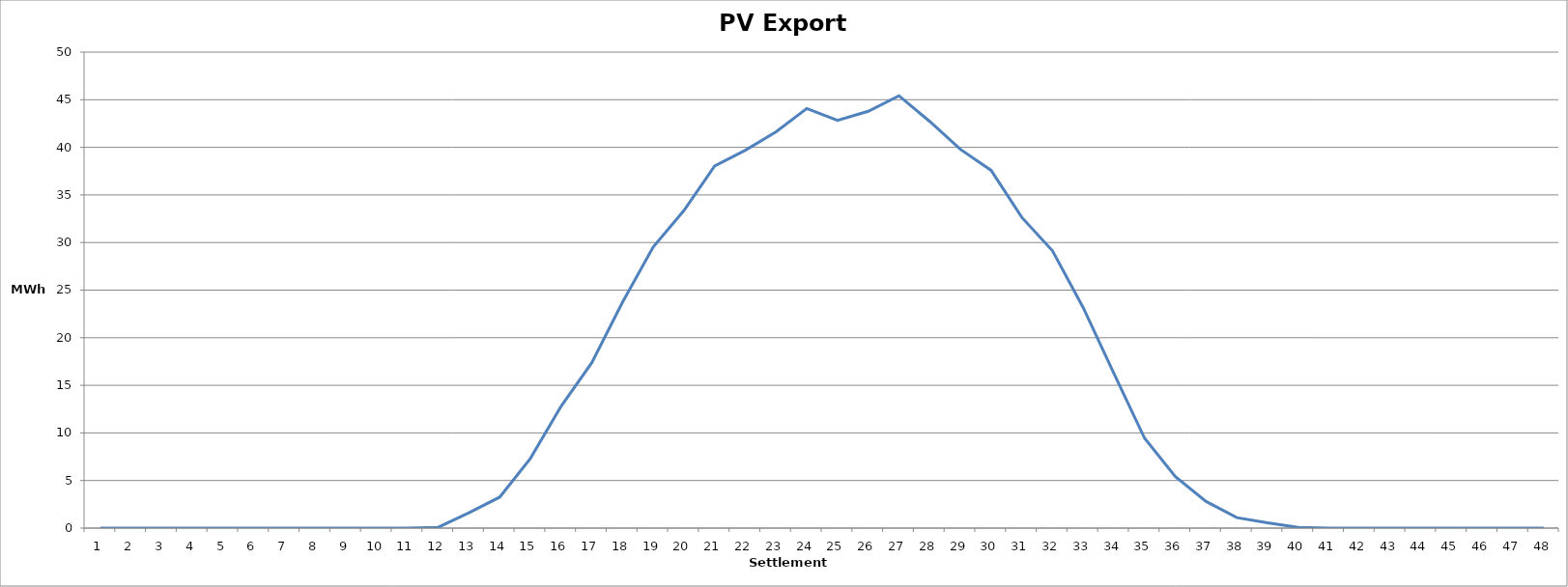
| Category | Series 0 |
|---|---|
| 0 | 0 |
| 1 | 0 |
| 2 | 0 |
| 3 | 0 |
| 4 | 0 |
| 5 | 0 |
| 6 | 0 |
| 7 | 0 |
| 8 | 0 |
| 9 | 0 |
| 10 | 0 |
| 11 | 0.084 |
| 12 | 1.617 |
| 13 | 3.252 |
| 14 | 7.32 |
| 15 | 12.797 |
| 16 | 17.376 |
| 17 | 23.73 |
| 18 | 29.525 |
| 19 | 33.358 |
| 20 | 38.046 |
| 21 | 39.697 |
| 22 | 41.634 |
| 23 | 44.08 |
| 24 | 42.827 |
| 25 | 43.79 |
| 26 | 45.416 |
| 27 | 42.723 |
| 28 | 39.793 |
| 29 | 37.587 |
| 30 | 32.64 |
| 31 | 29.126 |
| 32 | 23.153 |
| 33 | 16.231 |
| 34 | 9.43 |
| 35 | 5.408 |
| 36 | 2.801 |
| 37 | 1.102 |
| 38 | 0.56 |
| 39 | 0.076 |
| 40 | 0 |
| 41 | 0 |
| 42 | 0 |
| 43 | 0 |
| 44 | 0 |
| 45 | 0 |
| 46 | 0 |
| 47 | 0 |